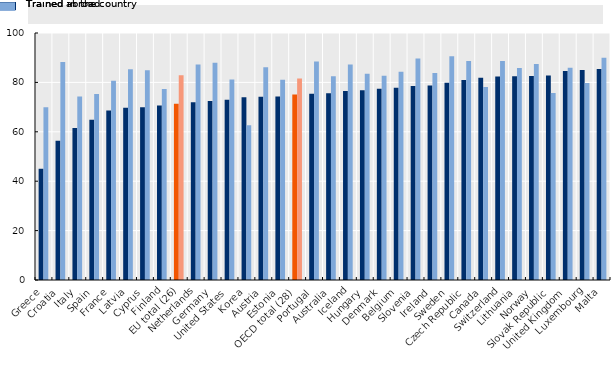
| Category | Trained abroad | Trained in the country |
|---|---|---|
| Greece | 45.035 | 69.969 |
| Croatia | 56.391 | 88.297 |
| Italy | 61.547 | 74.314 |
| Spain | 64.878 | 75.319 |
| France | 68.668 | 80.681 |
| Latvia | 69.769 | 85.293 |
| Cyprus | 69.894 | 84.911 |
| Finland | 70.635 | 77.281 |
| EU total (26) | 71.386 | 82.904 |
| Netherlands | 71.936 | 87.249 |
| Germany | 72.423 | 88.001 |
| United States | 72.979 | 81.158 |
| Korea | 73.948 | 62.646 |
| Austria | 74.236 | 86.153 |
| Estonia | 74.328 | 81.088 |
| OECD total (28) | 75.097 | 81.602 |
| Portugal | 75.449 | 88.446 |
| Australia | 75.654 | 82.453 |
| Iceland | 76.561 | 87.294 |
| Hungary | 76.812 | 83.475 |
| Denmark | 77.45 | 82.692 |
| Belgium | 77.84 | 84.308 |
| Slovenia | 78.59 | 89.67 |
| Ireland | 78.76 | 83.764 |
| Sweden | 79.828 | 90.595 |
| Czech Republic | 80.99 | 88.618 |
| Canada | 81.927 | 78.174 |
| Switzerland | 82.413 | 88.672 |
| Lithuania | 82.481 | 85.807 |
| Norway | 82.625 | 87.468 |
| Slovak Republic | 82.831 | 75.702 |
| United Kingdom | 84.63 | 85.888 |
| Luxembourg | 85.053 | 79.75 |
| Malta | 85.415 | 89.948 |